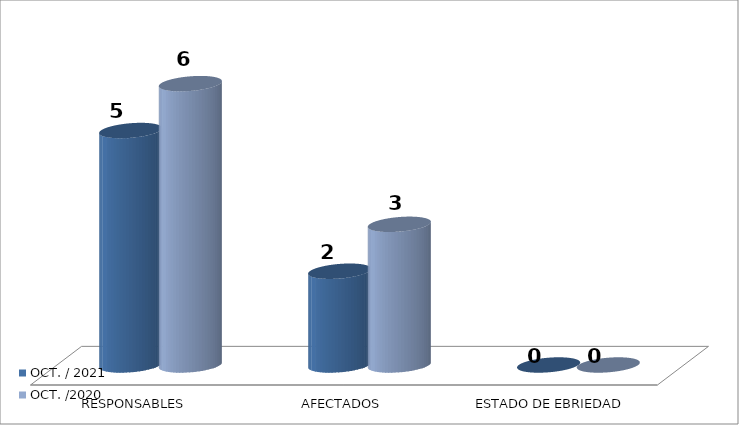
| Category | OCT. / 2021 | OCT. /2020 |
|---|---|---|
| RESPONSABLES | 5 | 6 |
| AFECTADOS | 2 | 3 |
| ESTADO DE EBRIEDAD | 0 | 0 |